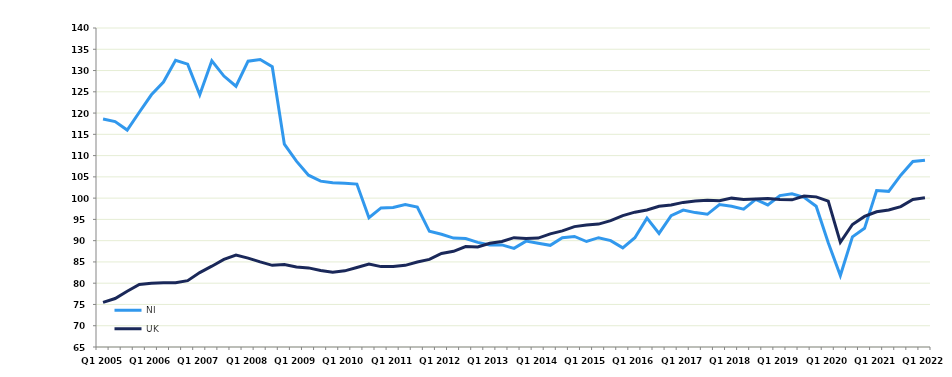
| Category | NI | UK |
|---|---|---|
| Q1 2005 | 118.6 | 75.5 |
|  | 118 | 76.4 |
|  | 116 | 78.1 |
|  | 120.2 | 79.7 |
| Q1 2006 | 124.3 | 80 |
|  | 127.3 | 80.1 |
|  | 132.4 | 80.1 |
|  | 131.5 | 80.6 |
| Q1 2007 | 124.3 | 82.5 |
|  | 132.3 | 84 |
|  | 128.7 | 85.6 |
|  | 126.3 | 86.6 |
| Q1 2008 | 132.2 | 85.9 |
|  | 132.6 | 85 |
|  | 130.9 | 84.2 |
|  | 112.7 | 84.4 |
| Q1 2009 | 108.7 | 83.8 |
|  | 105.4 | 83.6 |
|  | 104 | 83 |
|  | 103.6 | 82.6 |
| Q1 2010 | 103.5 | 82.9 |
|  | 103.3 | 83.7 |
|  | 95.4 | 84.5 |
|  | 97.7 | 83.9 |
| Q1 2011 | 97.8 | 83.9 |
|  | 98.5 | 84.2 |
|  | 97.9 | 85 |
|  | 92.2 | 85.6 |
| Q1 2012 | 91.5 | 87 |
|  | 90.6 | 87.5 |
|  | 90.5 | 88.6 |
|  | 89.6 | 88.5 |
| Q1 2013 | 89 | 89.4 |
|  | 89 | 89.8 |
|  | 88.2 | 90.7 |
|  | 89.9 | 90.5 |
| Q1 2014 | 89.4 | 90.6 |
|  | 88.9 | 91.6 |
|  | 90.7 | 92.3 |
|  | 91 | 93.3 |
| Q1 2015 | 89.8 | 93.7 |
|  | 90.7 | 93.9 |
|  | 90 | 94.7 |
|  | 88.3 | 95.9 |
| Q1 2016 | 90.7 | 96.7 |
|  | 95.3 | 97.2 |
|  | 91.7 | 98.1 |
|  | 95.9 | 98.4 |
| Q1 2017 | 97.2 | 99 |
|  | 96.6 | 99.3 |
|  | 96.2 | 99.5 |
|  | 98.5 | 99.4 |
| Q1 2018 | 98.1 | 100 |
|  | 97.4 | 99.7 |
|  | 99.7 | 99.8 |
|  | 98.4 | 99.9 |
| Q1 2019 | 100.6 | 99.7 |
|  | 101 | 99.6 |
|  | 100.2 | 100.5 |
|  | 98.1 | 100.3 |
| Q1 2020 | 89.5 | 99.3 |
|  | 81.8 | 89.6 |
|  | 90.9 | 93.8 |
|  | 92.9 | 95.7 |
| Q1 2021 | 101.8 | 96.8 |
|  | 101.6 | 97.2 |
|  | 105.4 | 98 |
|  | 108.6 | 99.7 |
| Q1 2022 | 108.9 | 100.1 |